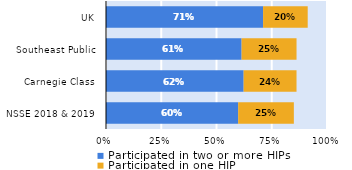
| Category | Participated in two or more HIPs | Participated in one HIP |
|---|---|---|
| NSSE 2018 & 2019 | 0.598 | 0.252 |
| Carnegie Class | 0.623 | 0.239 |
| Southeast Public | 0.614 | 0.249 |
| UK | 0.711 | 0.202 |